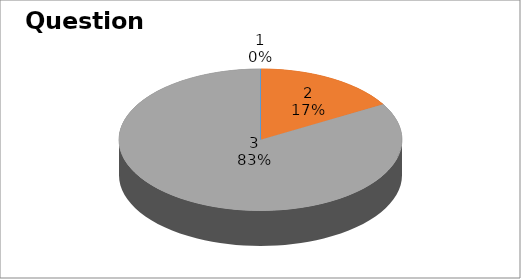
| Category | Series 0 |
|---|---|
| 0 | 0 |
| 1 | 1 |
| 2 | 5 |